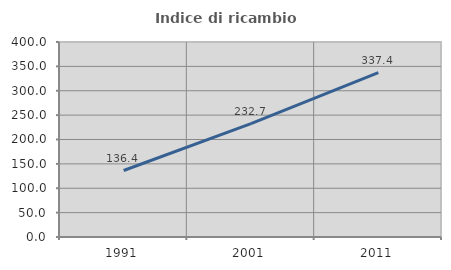
| Category | Indice di ricambio occupazionale  |
|---|---|
| 1991.0 | 136.38 |
| 2001.0 | 232.708 |
| 2011.0 | 337.391 |